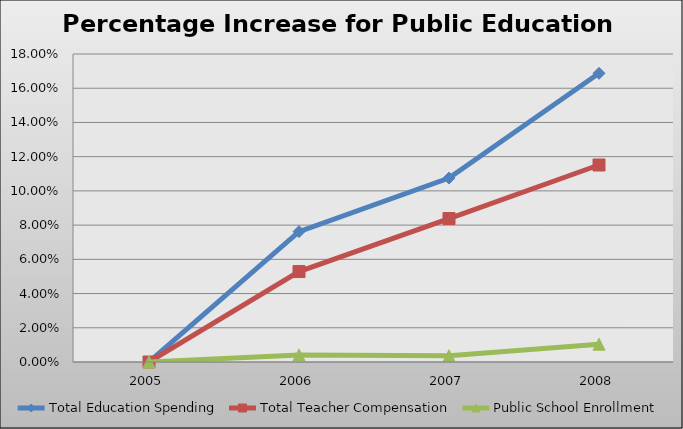
| Category | Total Education Spending | Total Teacher Compensation | Public School Enrollment |
|---|---|---|---|
| 2005 | 0 | 0 | 0 |
| 2006 | 0.076 | 0.053 | 0.004 |
| 2007 | 0.107 | 0.084 | 0.004 |
| 2008 | 0.169 | 0.115 | 0.01 |